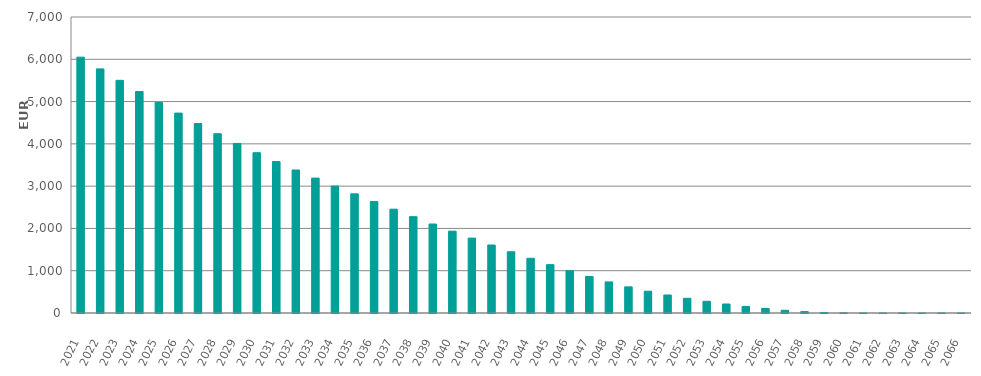
| Category | EUR Millions |
|---|---|
| 2021.0 | 6050000000.19 |
| 2022.0 | 5773104111.029 |
| 2023.0 | 5502044178.576 |
| 2024.0 | 5237939568.679 |
| 2025.0 | 4979945443.385 |
| 2026.0 | 4727454621.18 |
| 2027.0 | 4480491788.839 |
| 2028.0 | 4240000788.46 |
| 2029.0 | 4010174143.989 |
| 2030.0 | 3791085264.634 |
| 2031.0 | 3581762478.728 |
| 2032.0 | 3381928629.221 |
| 2033.0 | 3190053561.699 |
| 2034.0 | 3002003856.789 |
| 2035.0 | 2817836252.909 |
| 2036.0 | 2636405622.512 |
| 2037.0 | 2455265632.261 |
| 2038.0 | 2277891328.474 |
| 2039.0 | 2104543464.857 |
| 2040.0 | 1935819934.381 |
| 2041.0 | 1771282269.273 |
| 2042.0 | 1608346244.636 |
| 2043.0 | 1448674688.752 |
| 2044.0 | 1293605851.726 |
| 2045.0 | 1143496328.041 |
| 2046.0 | 999390636.425 |
| 2047.0 | 862559083.678 |
| 2048.0 | 735019967.955 |
| 2049.0 | 618349318.203 |
| 2050.0 | 514733750.231 |
| 2051.0 | 425762924.034 |
| 2052.0 | 347817335.828 |
| 2053.0 | 276900634.062 |
| 2054.0 | 213146467.143 |
| 2055.0 | 156348595.582 |
| 2056.0 | 106777100.058 |
| 2057.0 | 65172611.835 |
| 2058.0 | 33508632.212 |
| 2059.0 | 12889736.527 |
| 2060.0 | 2870613.366 |
| 2061.0 | 104232.202 |
| 2062.0 | 32374.663 |
| 2063.0 | 9892.085 |
| 2064.0 | 2302.554 |
| 2065.0 | 0 |
| 2066.0 | 0 |